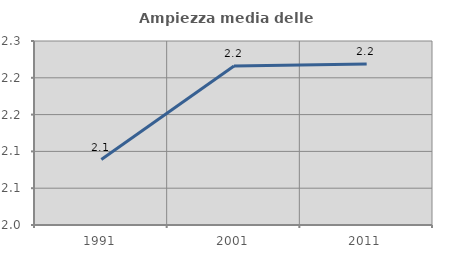
| Category | Ampiezza media delle famiglie |
|---|---|
| 1991.0 | 2.089 |
| 2001.0 | 2.216 |
| 2011.0 | 2.219 |